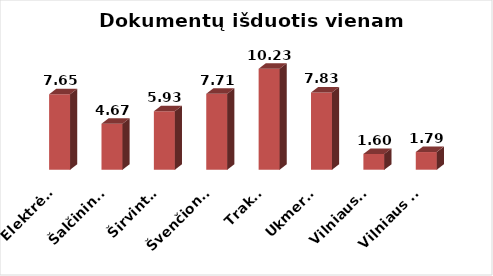
| Category | Series 0 |
|---|---|
|  Elektrėnai | 7.651 |
|  Šalčininkai | 4.665 |
|  Širvintos | 5.934 |
|  Švenčionys | 7.709 |
|  Trakai | 10.234 |
|  Ukmergė | 7.825 |
|  Vilniaus r. | 1.603 |
|  Vilniaus m. | 1.79 |